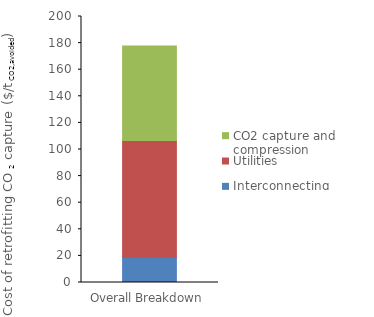
| Category | Interconnecting | Utilities | CO2 capture and compression |
|---|---|---|---|
| 0 | 18.919 | 87.777 | 71.068 |